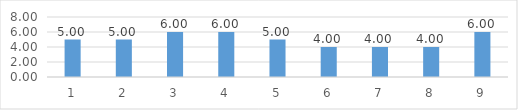
| Category | Series 0 |
|---|---|
| 0 | 5 |
| 1 | 5 |
| 2 | 6 |
| 3 | 6 |
| 4 | 5 |
| 5 | 4 |
| 6 | 4 |
| 7 | 4 |
| 8 | 6 |